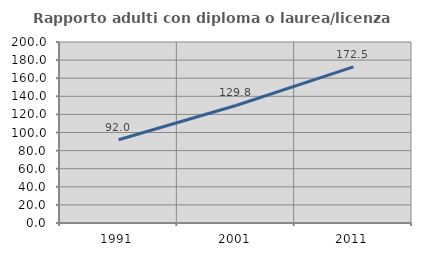
| Category | Rapporto adulti con diploma o laurea/licenza media  |
|---|---|
| 1991.0 | 91.97 |
| 2001.0 | 129.845 |
| 2011.0 | 172.549 |